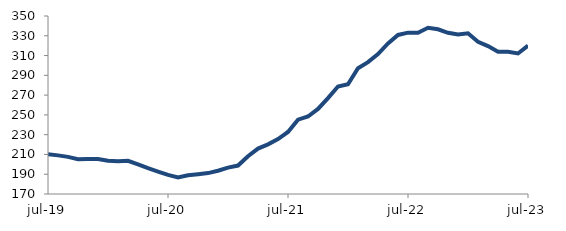
| Category | Series 0 |
|---|---|
| 2019-07-01 | 210.303 |
| 2019-08-01 | 209.058 |
| 2019-09-01 | 207.556 |
| 2019-10-01 | 205.179 |
| 2019-11-01 | 205.444 |
| 2019-12-01 | 205.45 |
| 2020-01-01 | 203.595 |
| 2020-02-01 | 202.996 |
| 2020-03-01 | 203.606 |
| 2020-04-01 | 199.997 |
| 2020-05-01 | 196.129 |
| 2020-06-01 | 192.644 |
| 2020-07-01 | 189.309 |
| 2020-08-01 | 186.635 |
| 2020-09-01 | 188.903 |
| 2020-10-01 | 189.967 |
| 2020-11-01 | 191.14 |
| 2020-12-01 | 193.522 |
| 2021-01-01 | 196.705 |
| 2021-02-01 | 198.76 |
| 2021-03-01 | 208.155 |
| 2021-04-01 | 215.916 |
| 2021-05-01 | 220.213 |
| 2021-06-01 | 225.532 |
| 2021-07-01 | 232.751 |
| 2021-08-01 | 245.217 |
| 2021-09-01 | 248.367 |
| 2021-10-01 | 256.011 |
| 2021-11-01 | 267.005 |
| 2021-12-01 | 278.738 |
| 2022-01-01 | 281.024 |
| 2022-02-01 | 297.23 |
| 2022-03-01 | 303.362 |
| 2022-04-01 | 311.514 |
| 2022-05-01 | 322.269 |
| 2022-06-01 | 330.847 |
| 2022-07-01 | 333.173 |
| 2022-08-01 | 333.056 |
| 2022-09-01 | 338.053 |
| 2022-10-01 | 336.541 |
| 2022-11-01 | 333.017 |
| 2022-12-01 | 331.349 |
| 2023-01-01 | 332.533 |
| 2023-02-01 | 323.969 |
| 2023-03-01 | 319.613 |
| 2023-04-01 | 313.925 |
| 2023-05-01 | 313.735 |
| 2023-06-01 | 312.115 |
| 2023-07-01 | 320.047 |